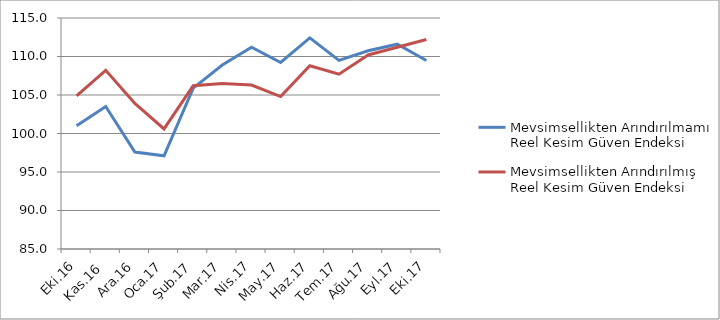
| Category | Mevsimsellikten Arındırılmamış Reel Kesim Güven Endeksi | Mevsimsellikten Arındırılmış Reel Kesim Güven Endeksi |
|---|---|---|
| Eki.16 | 101 | 104.9 |
| Kas.16 | 103.5 | 108.2 |
| Ara.16 | 97.6 | 103.9 |
| Oca.17 | 97.1 | 100.6 |
| Şub.17 | 105.9 | 106.2 |
| Mar.17 | 108.9 | 106.5 |
| Nis.17 | 111.2 | 106.3 |
| May.17 | 109.225 | 104.8 |
| Haz.17 | 112.412 | 108.8 |
| Tem.17 | 109.488 | 107.7 |
| Ağu.17 | 110.738 | 110.2 |
| Eyl.17 | 111.6 | 111.2 |
| Eki.17 | 109.488 | 112.2 |